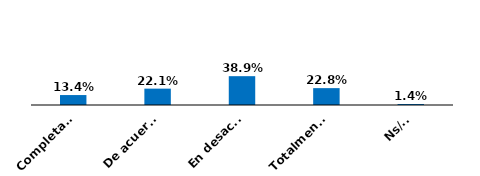
| Category | Series 0 |
|---|---|
| Completamente de acuerdo | 0.134 |
| De acuerdo | 0.221 |
| En desacuerdo | 0.389 |
| Totalmente en desacuerdo | 0.228 |
| Ns/Nr | 0.014 |